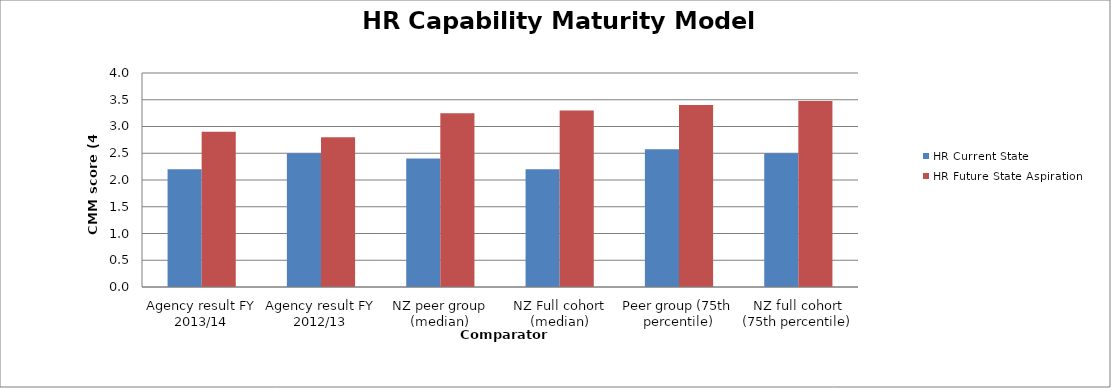
| Category | HR Current State | HR Future State Aspiration |
|---|---|---|
| Agency result FY 2013/14 | 2.2 | 2.9 |
| Agency result FY 2012/13 | 2.5 | 2.8 |
| NZ peer group (median) | 2.4 | 3.25 |
| NZ Full cohort (median) | 2.2 | 3.3 |
| Peer group (75th percentile) | 2.575 | 3.4 |
| NZ full cohort (75th percentile) | 2.5 | 3.475 |